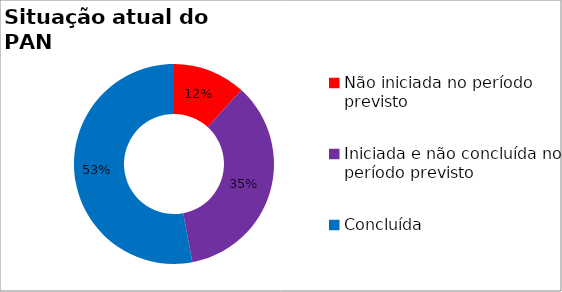
| Category | Series 0 |
|---|---|
| Não iniciada no período previsto | 0.118 |
| Iniciada e não concluída no período previsto | 0.353 |
| Concluída | 0.529 |